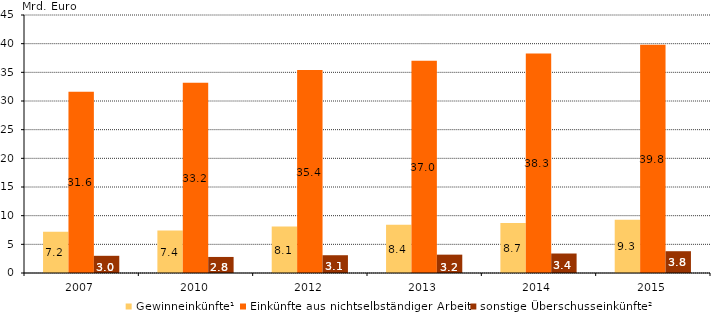
| Category | Gewinneinkünfte¹ | Einkünfte aus nichtselbständiger Arbeit | sonstige Überschusseinkünfte² |
|---|---|---|---|
| 2007.0 | 7.2 | 31.6 | 3 |
| 2010.0 | 7.4 | 33.2 | 2.8 |
| 2012.0 | 8.1 | 35.4 | 3.1 |
| 2013.0 | 8.4 | 37 | 3.2 |
| 2014.0 | 8.7 | 38.3 | 3.4 |
| 2015.0 | 9.3 | 39.8 | 3.8 |